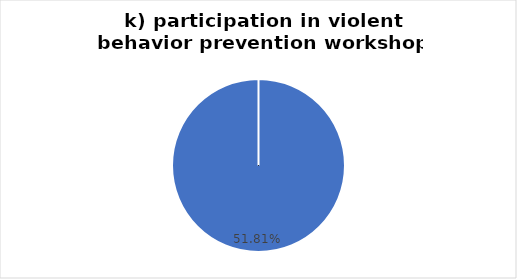
| Category | k) workshop on preventing violent behavior |
|---|---|
| 0 | 0.518 |